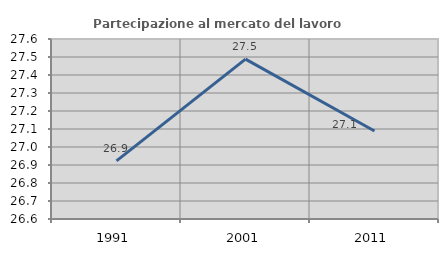
| Category | Partecipazione al mercato del lavoro  femminile |
|---|---|
| 1991.0 | 26.923 |
| 2001.0 | 27.488 |
| 2011.0 | 27.089 |